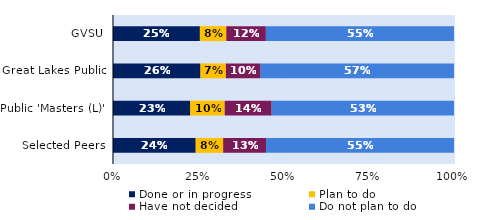
| Category | Done or in progress | Plan to do | Have not decided | Do not plan to do |
|---|---|---|---|---|
| GVSU | 0.255 | 0.077 | 0.116 | 0.552 |
| Great Lakes Public | 0.257 | 0.074 | 0.102 | 0.567 |
| Public 'Masters (L)' | 0.227 | 0.101 | 0.138 | 0.535 |
| Selected Peers | 0.243 | 0.08 | 0.126 | 0.551 |